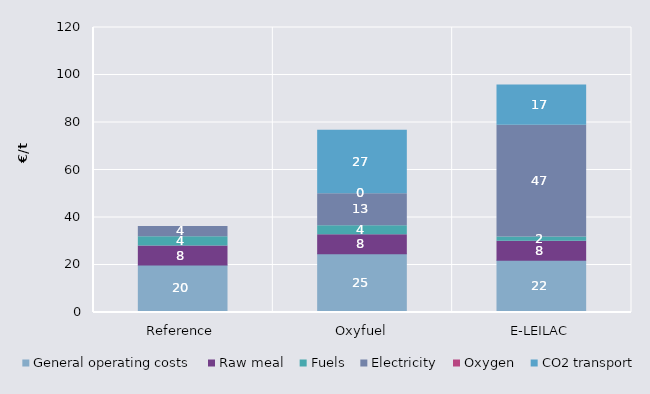
| Category | General operating costs | Raw meal | Fuels | Electricity | Oxygen | CO2 transport |
|---|---|---|---|---|---|---|
| Reference | 20 | 8 | 3.873 | 4.375 | 0 | 0 |
| Oxyfuel | 24.695 | 8 | 3.873 | 13.384 | 0 | 26.796 |
| E-LEILAC | 22 | 8 | 1.815 | 47.04 | 0 | 16.956 |